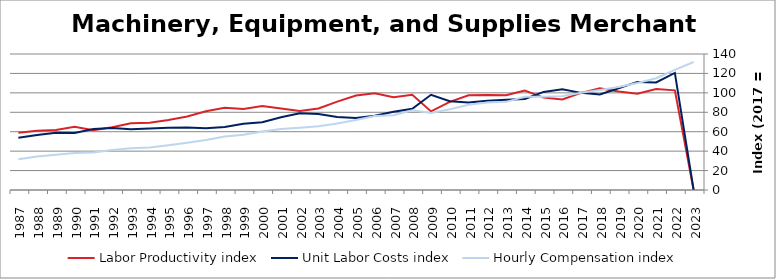
| Category | Labor Productivity index | Unit Labor Costs index | Hourly Compensation index |
|---|---|---|---|
| 2023.0 | 0 | 0 | 131.795 |
| 2022.0 | 102.592 | 120.497 | 123.621 |
| 2021.0 | 103.975 | 110.703 | 115.103 |
| 2020.0 | 99.056 | 111.279 | 110.229 |
| 2019.0 | 101.324 | 104.699 | 106.086 |
| 2018.0 | 104.716 | 98.326 | 102.963 |
| 2017.0 | 100 | 100 | 100 |
| 2016.0 | 93.18 | 103.707 | 96.635 |
| 2015.0 | 95.153 | 100.985 | 96.09 |
| 2014.0 | 102.283 | 93.742 | 95.882 |
| 2013.0 | 97.647 | 92.902 | 90.716 |
| 2012.0 | 97.878 | 91.914 | 89.964 |
| 2011.0 | 97.432 | 90.042 | 87.729 |
| 2010.0 | 90.754 | 91.474 | 83.016 |
| 2009.0 | 80.933 | 98.027 | 79.336 |
| 2008.0 | 98.121 | 83.584 | 82.014 |
| 2007.0 | 95.578 | 80.63 | 77.064 |
| 2006.0 | 99.613 | 76.363 | 76.068 |
| 2005.0 | 97.266 | 74.151 | 72.124 |
| 2004.0 | 91.03 | 75.129 | 68.39 |
| 2003.0 | 83.914 | 78.332 | 65.732 |
| 2002.0 | 81.251 | 78.904 | 64.11 |
| 2001.0 | 83.827 | 74.92 | 62.804 |
| 2000.0 | 86.365 | 69.807 | 60.288 |
| 1999.0 | 83.499 | 68.088 | 56.853 |
| 1998.0 | 84.622 | 64.948 | 54.96 |
| 1997.0 | 81.016 | 63.592 | 51.52 |
| 1996.0 | 75.694 | 64.355 | 48.712 |
| 1995.0 | 72.162 | 64.002 | 46.185 |
| 1994.0 | 69.333 | 63.225 | 43.836 |
| 1993.0 | 68.796 | 62.54 | 43.025 |
| 1992.0 | 64.643 | 63.809 | 41.248 |
| 1991.0 | 61.437 | 62.706 | 38.524 |
| 1990.0 | 64.975 | 58.634 | 38.098 |
| 1989.0 | 61.757 | 58.942 | 36.401 |
| 1988.0 | 61.115 | 56.514 | 34.539 |
| 1987.0 | 59.051 | 53.713 | 31.718 |